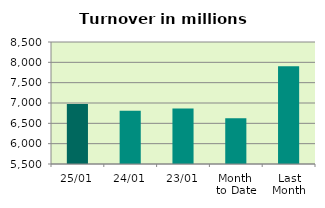
| Category | Series 0 |
|---|---|
| 25/01 | 6975.421 |
| 24/01 | 6807.854 |
| 23/01 | 6867.463 |
| Month 
to Date | 6624.868 |
| Last
Month | 7903.143 |